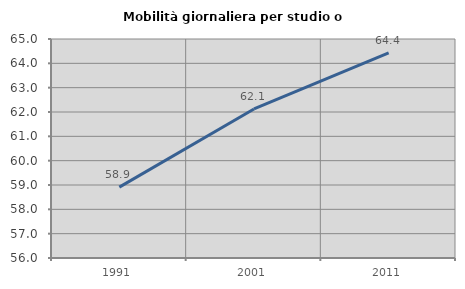
| Category | Mobilità giornaliera per studio o lavoro |
|---|---|
| 1991.0 | 58.914 |
| 2001.0 | 62.126 |
| 2011.0 | 64.428 |